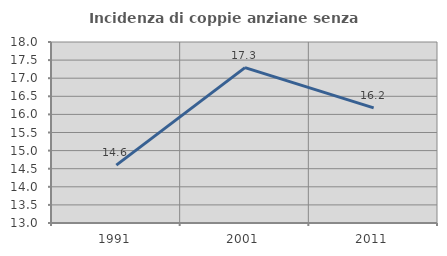
| Category | Incidenza di coppie anziane senza figli  |
|---|---|
| 1991.0 | 14.599 |
| 2001.0 | 17.292 |
| 2011.0 | 16.179 |